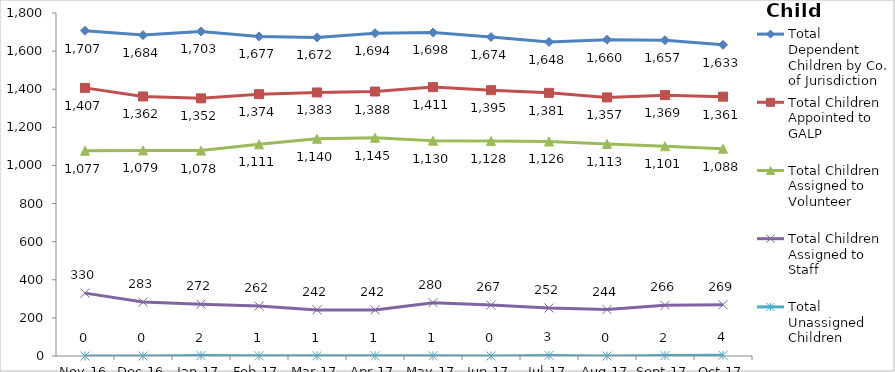
| Category | Total Dependent Children by Co. of Jurisdiction | Total Children Appointed to GALP | Total Children Assigned to Volunteer | Total Children Assigned to Staff | Total Unassigned Children |
|---|---|---|---|---|---|
| 2016-11-01 | 1707 | 1407 | 1077 | 330 | 0 |
| 2016-12-01 | 1684 | 1362 | 1079 | 283 | 0 |
| 2017-01-01 | 1703 | 1352 | 1078 | 272 | 2 |
| 2017-02-01 | 1677 | 1374 | 1111 | 262 | 1 |
| 2017-03-01 | 1672 | 1383 | 1140 | 242 | 1 |
| 2017-04-01 | 1694 | 1388 | 1145 | 242 | 1 |
| 2017-05-01 | 1698 | 1411 | 1130 | 280 | 1 |
| 2017-06-01 | 1674 | 1395 | 1128 | 267 | 0 |
| 2017-07-01 | 1648 | 1381 | 1126 | 252 | 3 |
| 2017-08-01 | 1660 | 1357 | 1113 | 244 | 0 |
| 2017-09-01 | 1657 | 1369 | 1101 | 266 | 2 |
| 2017-10-01 | 1633 | 1361 | 1088 | 269 | 4 |